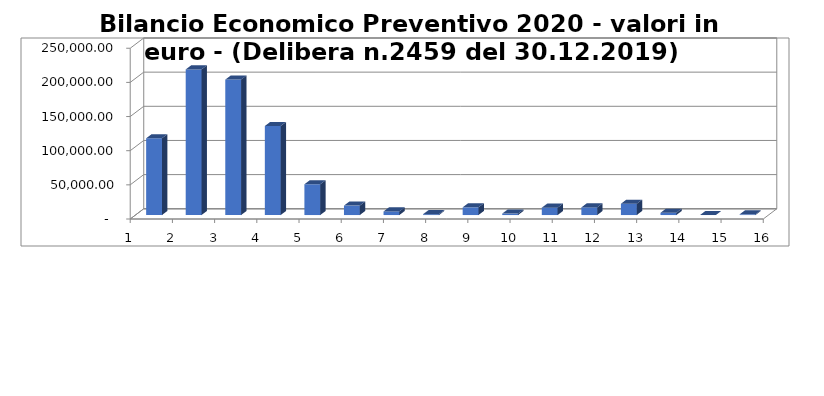
| Category | Bilancio Economico Preventivo 2020 - valori in euro - (Delibera n.2459 del 30.12.2019) |
|---|---|
| 0 | 112399.8 |
| 01/01/1900 | 213206.699 |
| 02/01/1900 | 198270.941 |
| 03/01/1900 | 130377.428 |
| 04/01/1900 | 45054.966 |
| 05/01/1900 | 13802.146 |
| 06/01/1900 | 5249.082 |
| 07/01/1900 | 1222.284 |
| 08/01/1900 | 11300.049 |
| 09/01/1900 | 2107.27 |
| 10/01/1900 | 10770.847 |
| 11/01/1900 | 11178.996 |
| 12/01/1900 | 16561.595 |
| 13/01/1900 | 3315.283 |
| 14/01/1900 | 47.393 |
| 15/01/1900 | 1000 |